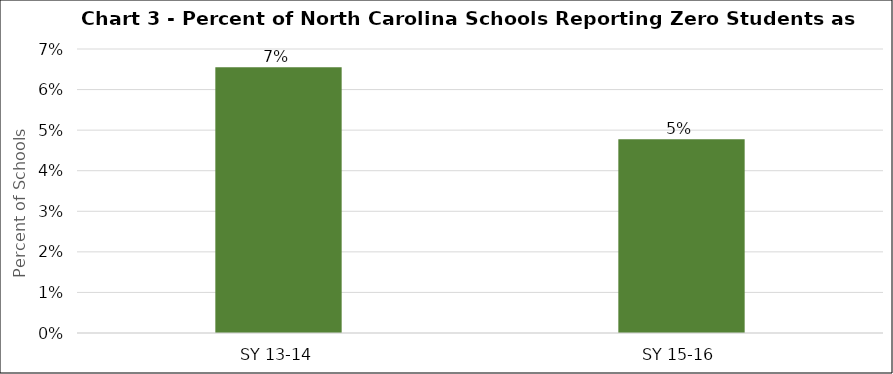
| Category | Series 0 |
|---|---|
| SY 13-14 | 0.066 |
| SY 15-16 | 0.048 |